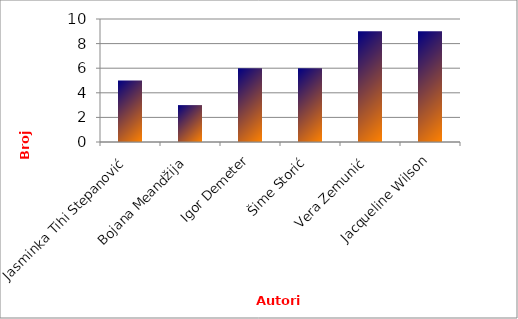
| Category | Broj primjeraka |
|---|---|
| Jasminka Tihi Stepanović | 5 |
| Bojana Meandžija | 3 |
| Igor Demeter | 6 |
| Šime Storić | 6 |
| Vera Zemunić | 9 |
| Jacqueline Wilson | 9 |